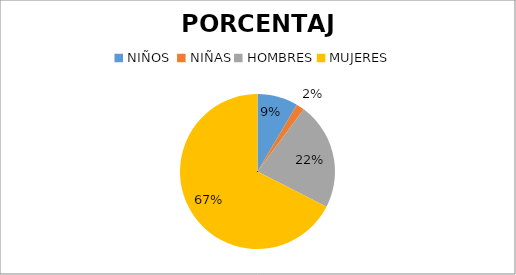
| Category | PORCENTAJE | CANTIDAD |
|---|---|---|
| NIÑOS  | 8.475 | 25 |
| NIÑAS | 1.695 | 5 |
| HOMBRES | 22.373 | 66 |
| MUJERES | 67.458 | 199 |